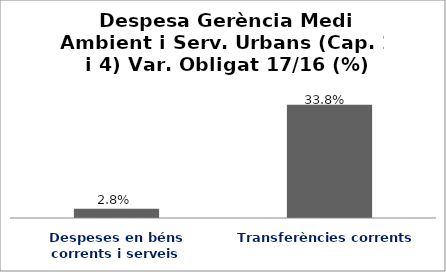
| Category | Series 0 |
|---|---|
| Despeses en béns corrents i serveis | 0.028 |
| Transferències corrents | 0.338 |